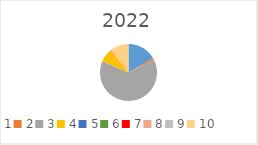
| Category | Series 0 |
|---|---|
| 1.0 | 1622386 |
| 2.0 | 113514 |
| 3.0 | 6273663 |
| 4.0 | 755121 |
| 5.0 | 0 |
| 6.0 | 0 |
| 7.0 | 14565 |
| 8.0 | 0 |
| 9.0 | 9200 |
| 10.0 | 1040827 |